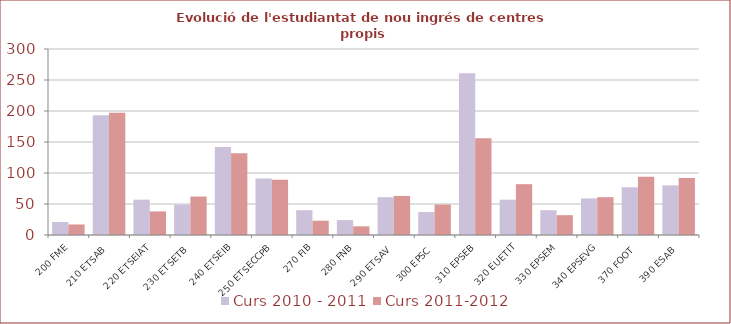
| Category | Curs 2010 - 2011 | Curs 2011-2012 |
|---|---|---|
| 200 FME | 21 | 17 |
| 210 ETSAB | 193 | 197 |
| 220 ETSEIAT | 57 | 38 |
| 230 ETSETB | 49 | 62 |
| 240 ETSEIB | 142 | 132 |
| 250 ETSECCPB | 91 | 89 |
| 270 FIB | 40 | 23 |
| 280 FNB | 24 | 14 |
| 290 ETSAV | 61 | 63 |
| 300 EPSC | 37 | 49 |
| 310 EPSEB | 261 | 156 |
| 320 EUETIT | 57 | 82 |
| 330 EPSEM | 40 | 32 |
| 340 EPSEVG | 59 | 61 |
| 370 FOOT | 77 | 94 |
| 390 ESAB | 80 | 92 |